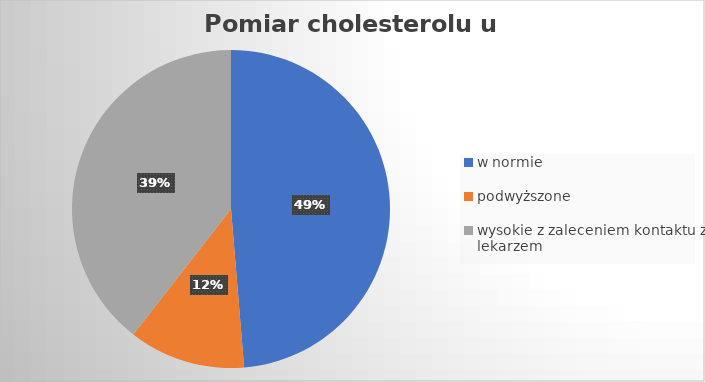
| Category | Series 0 |
|---|---|
| w normie | 48.684 |
| podwyższone | 11.842 |
| wysokie z zaleceniem kontaktu z lekarzem | 39.474 |